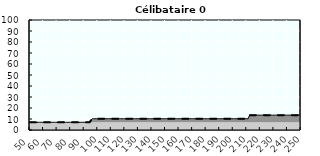
| Category | Coin fiscal marginal (somme des composantes) | Taux d’imposition marginal net |
|---|---|---|
| 50.0 | 7 | 7 |
| 51.0 | 7 | 7 |
| 52.0 | 7 | 7 |
| 53.0 | 7 | 7 |
| 54.0 | 7 | 7 |
| 55.0 | 7 | 7 |
| 56.0 | 7 | 7 |
| 57.0 | 7 | 7 |
| 58.0 | 7 | 7 |
| 59.0 | 7 | 7 |
| 60.0 | 7 | 7 |
| 61.0 | 7 | 7 |
| 62.0 | 7 | 7 |
| 63.0 | 7 | 7 |
| 64.0 | 7 | 7 |
| 65.0 | 7 | 7 |
| 66.0 | 7 | 7 |
| 67.0 | 7 | 7 |
| 68.0 | 7 | 7 |
| 69.0 | 7 | 7 |
| 70.0 | 7 | 7 |
| 71.0 | 7 | 7 |
| 72.0 | 7 | 7 |
| 73.0 | 7 | 7 |
| 74.0 | 7 | 7 |
| 75.0 | 7 | 7 |
| 76.0 | 7 | 7 |
| 77.0 | 7 | 7 |
| 78.0 | 7 | 7 |
| 79.0 | 7 | 7 |
| 80.0 | 7 | 7 |
| 81.0 | 7 | 7 |
| 82.0 | 7 | 7 |
| 83.0 | 7 | 7 |
| 84.0 | 7 | 7 |
| 85.0 | 7 | 7 |
| 86.0 | 7 | 7 |
| 87.0 | 7 | 7 |
| 88.0 | 7 | 7 |
| 89.0 | 7 | 7 |
| 90.0 | 7 | 7 |
| 91.0 | 7 | 7 |
| 92.0 | 7 | 7 |
| 93.0 | 7 | 7 |
| 94.0 | 7 | 7 |
| 95.0 | 8.891 | 8.891 |
| 96.0 | 10.25 | 10.25 |
| 97.0 | 10.25 | 10.25 |
| 98.0 | 10.25 | 10.25 |
| 99.0 | 10.25 | 10.25 |
| 100.0 | 10.25 | 10.25 |
| 101.0 | 10.25 | 10.25 |
| 102.0 | 10.25 | 10.25 |
| 103.0 | 10.25 | 10.25 |
| 104.0 | 10.25 | 10.25 |
| 105.0 | 10.25 | 10.25 |
| 106.0 | 10.25 | 10.25 |
| 107.0 | 10.25 | 10.25 |
| 108.0 | 10.25 | 10.25 |
| 109.0 | 10.25 | 10.25 |
| 110.0 | 10.25 | 10.25 |
| 111.0 | 10.25 | 10.25 |
| 112.0 | 10.25 | 10.25 |
| 113.0 | 10.25 | 10.25 |
| 114.0 | 10.25 | 10.25 |
| 115.0 | 10.25 | 10.25 |
| 116.0 | 10.25 | 10.25 |
| 117.0 | 10.25 | 10.25 |
| 118.0 | 10.25 | 10.25 |
| 119.0 | 10.25 | 10.25 |
| 120.0 | 10.25 | 10.25 |
| 121.0 | 10.25 | 10.25 |
| 122.0 | 10.25 | 10.25 |
| 123.0 | 10.25 | 10.25 |
| 124.0 | 10.25 | 10.25 |
| 125.0 | 10.25 | 10.25 |
| 126.0 | 10.25 | 10.25 |
| 127.0 | 10.25 | 10.25 |
| 128.0 | 10.25 | 10.25 |
| 129.0 | 10.25 | 10.25 |
| 130.0 | 10.25 | 10.25 |
| 131.0 | 10.25 | 10.25 |
| 132.0 | 10.25 | 10.25 |
| 133.0 | 10.25 | 10.25 |
| 134.0 | 10.25 | 10.25 |
| 135.0 | 10.25 | 10.25 |
| 136.0 | 10.25 | 10.25 |
| 137.0 | 10.25 | 10.25 |
| 138.0 | 10.25 | 10.25 |
| 139.0 | 10.25 | 10.25 |
| 140.0 | 10.25 | 10.25 |
| 141.0 | 10.25 | 10.25 |
| 142.0 | 10.25 | 10.25 |
| 143.0 | 10.25 | 10.25 |
| 144.0 | 10.25 | 10.25 |
| 145.0 | 10.25 | 10.25 |
| 146.0 | 10.25 | 10.25 |
| 147.0 | 10.25 | 10.25 |
| 148.0 | 10.25 | 10.25 |
| 149.0 | 10.25 | 10.25 |
| 150.0 | 10.25 | 10.25 |
| 151.0 | 10.25 | 10.25 |
| 152.0 | 10.25 | 10.25 |
| 153.0 | 10.25 | 10.25 |
| 154.0 | 10.25 | 10.25 |
| 155.0 | 10.25 | 10.25 |
| 156.0 | 10.25 | 10.25 |
| 157.0 | 10.25 | 10.25 |
| 158.0 | 10.25 | 10.25 |
| 159.0 | 10.25 | 10.25 |
| 160.0 | 10.25 | 10.25 |
| 161.0 | 10.25 | 10.25 |
| 162.0 | 10.25 | 10.25 |
| 163.0 | 10.25 | 10.25 |
| 164.0 | 10.25 | 10.25 |
| 165.0 | 10.25 | 10.25 |
| 166.0 | 10.25 | 10.25 |
| 167.0 | 10.25 | 10.25 |
| 168.0 | 10.25 | 10.25 |
| 169.0 | 10.25 | 10.25 |
| 170.0 | 10.25 | 10.25 |
| 171.0 | 10.25 | 10.25 |
| 172.0 | 10.25 | 10.25 |
| 173.0 | 10.25 | 10.25 |
| 174.0 | 10.25 | 10.25 |
| 175.0 | 10.25 | 10.25 |
| 176.0 | 10.25 | 10.25 |
| 177.0 | 10.25 | 10.25 |
| 178.0 | 10.25 | 10.25 |
| 179.0 | 10.25 | 10.25 |
| 180.0 | 10.25 | 10.25 |
| 181.0 | 10.25 | 10.25 |
| 182.0 | 10.25 | 10.25 |
| 183.0 | 10.25 | 10.25 |
| 184.0 | 10.25 | 10.25 |
| 185.0 | 10.25 | 10.25 |
| 186.0 | 10.25 | 10.25 |
| 187.0 | 10.25 | 10.25 |
| 188.0 | 10.25 | 10.25 |
| 189.0 | 10.25 | 10.25 |
| 190.0 | 10.25 | 10.25 |
| 191.0 | 10.25 | 10.25 |
| 192.0 | 10.25 | 10.25 |
| 193.0 | 10.25 | 10.25 |
| 194.0 | 10.25 | 10.25 |
| 195.0 | 10.25 | 10.25 |
| 196.0 | 10.25 | 10.25 |
| 197.0 | 10.25 | 10.25 |
| 198.0 | 10.25 | 10.25 |
| 199.0 | 10.25 | 10.25 |
| 200.0 | 10.25 | 10.25 |
| 201.0 | 10.25 | 10.25 |
| 202.0 | 10.25 | 10.25 |
| 203.0 | 10.25 | 10.25 |
| 204.0 | 10.25 | 10.25 |
| 205.0 | 10.25 | 10.25 |
| 206.0 | 10.25 | 10.25 |
| 207.0 | 10.25 | 10.25 |
| 208.0 | 10.25 | 10.25 |
| 209.0 | 10.25 | 10.25 |
| 210.0 | 10.25 | 10.25 |
| 211.0 | 10.25 | 10.25 |
| 212.0 | 13.369 | 13.369 |
| 213.0 | 13.5 | 13.5 |
| 214.0 | 13.5 | 13.5 |
| 215.0 | 13.5 | 13.5 |
| 216.0 | 13.5 | 13.5 |
| 217.0 | 13.5 | 13.5 |
| 218.0 | 13.5 | 13.5 |
| 219.0 | 13.5 | 13.5 |
| 220.0 | 13.5 | 13.5 |
| 221.0 | 13.5 | 13.5 |
| 222.0 | 13.5 | 13.5 |
| 223.0 | 13.5 | 13.5 |
| 224.0 | 13.5 | 13.5 |
| 225.0 | 13.5 | 13.5 |
| 226.0 | 13.5 | 13.5 |
| 227.0 | 13.5 | 13.5 |
| 228.0 | 13.5 | 13.5 |
| 229.0 | 13.5 | 13.5 |
| 230.0 | 13.5 | 13.5 |
| 231.0 | 13.5 | 13.5 |
| 232.0 | 13.5 | 13.5 |
| 233.0 | 13.5 | 13.5 |
| 234.0 | 13.5 | 13.5 |
| 235.0 | 13.5 | 13.5 |
| 236.0 | 13.5 | 13.5 |
| 237.0 | 13.5 | 13.5 |
| 238.0 | 13.5 | 13.5 |
| 239.0 | 13.5 | 13.5 |
| 240.0 | 13.5 | 13.5 |
| 241.0 | 13.5 | 13.5 |
| 242.0 | 13.5 | 13.5 |
| 243.0 | 13.5 | 13.5 |
| 244.0 | 13.5 | 13.5 |
| 245.0 | 13.5 | 13.5 |
| 246.0 | 13.5 | 13.5 |
| 247.0 | 13.5 | 13.5 |
| 248.0 | 13.5 | 13.5 |
| 249.0 | 13.5 | 13.5 |
| 250.0 | 13.5 | 13.5 |